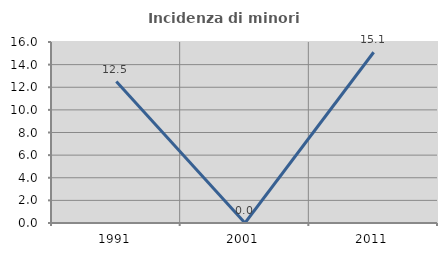
| Category | Incidenza di minori stranieri |
|---|---|
| 1991.0 | 12.5 |
| 2001.0 | 0 |
| 2011.0 | 15.094 |